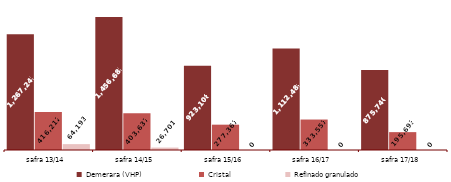
| Category | Demerara (VHP) | Cristal | Refinado granulado |
|---|---|---|---|
| safra 13/14 | 1267245 | 416212 | 64193 |
| safra 14/15 | 1456685 | 403637 | 26701 |
| safra 15/16 | 923108 | 277361 | 0 |
| safra 16/17 | 1112488 | 333551 | 0 |
| safra 17/18 | 875740 | 195693 | 0 |